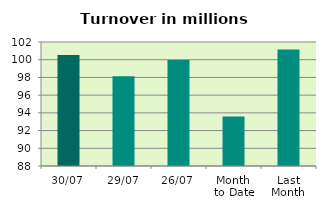
| Category | Series 0 |
|---|---|
| 30/07 | 100.533 |
| 29/07 | 98.132 |
| 26/07 | 99.968 |
| Month 
to Date | 93.581 |
| Last
Month | 101.166 |